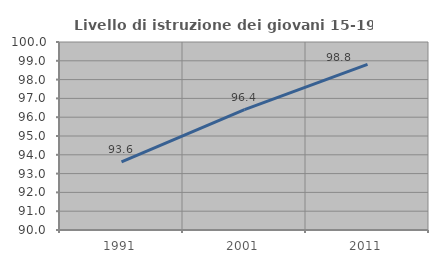
| Category | Livello di istruzione dei giovani 15-19 anni |
|---|---|
| 1991.0 | 93.622 |
| 2001.0 | 96.401 |
| 2011.0 | 98.811 |